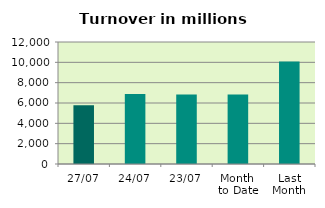
| Category | Series 0 |
|---|---|
| 27/07 | 5790.298 |
| 24/07 | 6896.34 |
| 23/07 | 6832.364 |
| Month 
to Date | 6843.838 |
| Last
Month | 10085.686 |